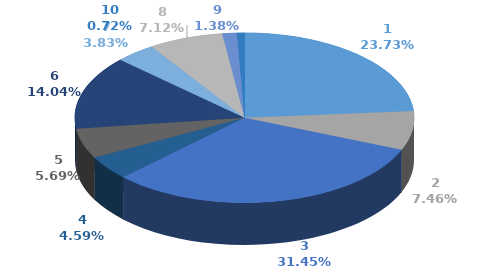
| Category | Series 0 |
|---|---|
| 0 | 330564 |
| 1 | 103877 |
| 2 | 438076 |
| 3 | 63872 |
| 4 | 79212 |
| 5 | 195583 |
| 6 | 53418 |
| 7 | 99143 |
| 8 | 19200 |
| 9 | 10000 |